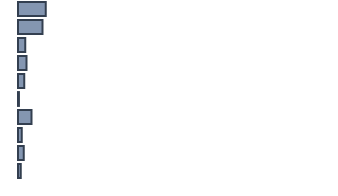
| Category | Percentatge |
|---|---|
| 0 | 8.8 |
| 1 | 7.8 |
| 2 | 2.3 |
| 3 | 2.7 |
| 4 | 2 |
| 5 | 0.3 |
| 6 | 4.3 |
| 7 | 1.2 |
| 8 | 1.8 |
| 9 | 0.9 |